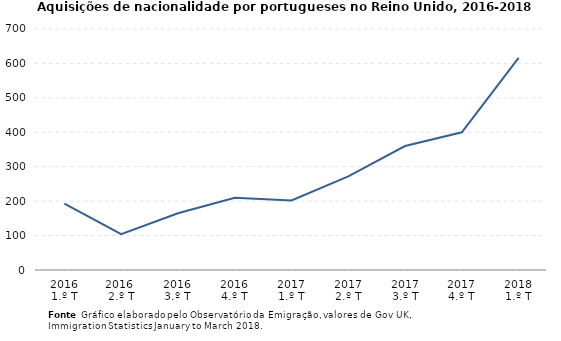
| Category | Series 0 |
|---|---|
| 2016
1.º T | 193 |
| 2016 
2.º T | 104 |
| 2016
3.º T | 165 |
| 2016
4.º T | 210 |
| 2017
1.º T | 202 |
| 2017
2.º T | 272 |
| 2017
3.º T | 360 |
| 2017
4.º T | 400 |
| 2018
1.º T | 616 |